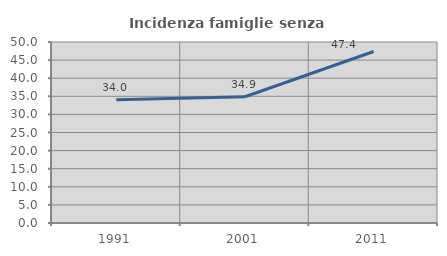
| Category | Incidenza famiglie senza nuclei |
|---|---|
| 1991.0 | 34.043 |
| 2001.0 | 34.874 |
| 2011.0 | 47.368 |